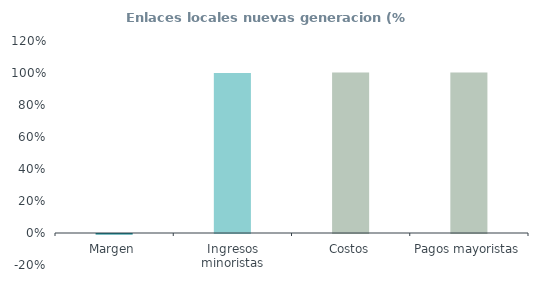
| Category | Enlaces locales nuevas generacion (% ingresos) |
|---|---|
| Margen | -0.003 |
| Ingresos minoristas | 1 |
| Costos | 1.003 |
| Pagos mayoristas | 1.003 |